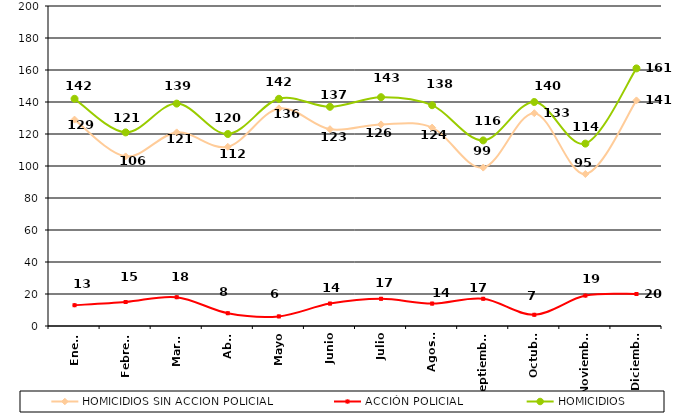
| Category | HOMICIDIOS SIN ACCION POLICIAL | ACCIÓN POLICIAL | HOMICIDIOS |
|---|---|---|---|
| Enero | 129 | 13 | 142 |
| Febrero | 106 | 15 | 121 |
| Marzo | 121 | 18 | 139 |
| Abril | 112 | 8 | 120 |
| Mayo | 136 | 6 | 142 |
| Junio | 123 | 14 | 137 |
| Julio | 126 | 17 | 143 |
| Agosto | 124 | 14 | 138 |
| Septiembre | 99 | 17 | 116 |
| Octubre | 133 | 7 | 140 |
| Noviembre | 95 | 19 | 114 |
| Diciembre | 141 | 20 | 161 |